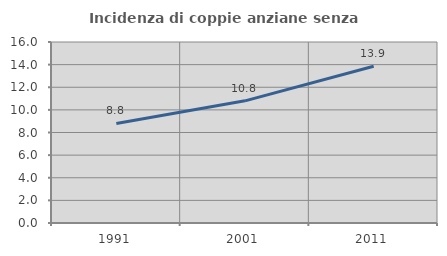
| Category | Incidenza di coppie anziane senza figli  |
|---|---|
| 1991.0 | 8.796 |
| 2001.0 | 10.799 |
| 2011.0 | 13.861 |